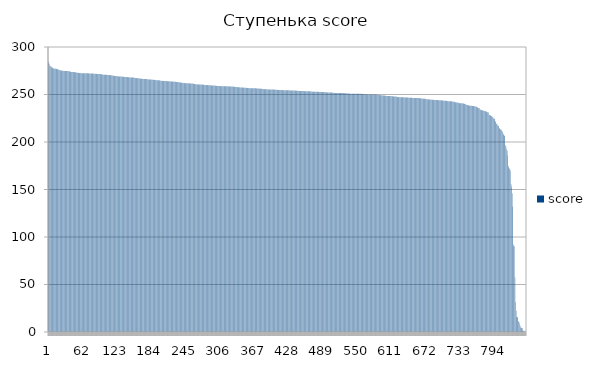
| Category | score |
|---|---|
| 0 | 284.9 |
| 1 | 283.2 |
| 2 | 282.4 |
| 3 | 279.9 |
| 4 | 279.7 |
| 5 | 279.5 |
| 6 | 278.6 |
| 7 | 278.5 |
| 8 | 277.8 |
| 9 | 277.4 |
| 10 | 277.4 |
| 11 | 277.4 |
| 12 | 277.3 |
| 13 | 277.1 |
| 14 | 277.1 |
| 15 | 276.9 |
| 16 | 276.9 |
| 17 | 276.4 |
| 18 | 276.2 |
| 19 | 276.1 |
| 20 | 275.9 |
| 21 | 275.4 |
| 22 | 275.2 |
| 23 | 275.2 |
| 24 | 275.1 |
| 25 | 275.1 |
| 26 | 275.1 |
| 27 | 275 |
| 28 | 275 |
| 29 | 274.8 |
| 30 | 274.8 |
| 31 | 274.7 |
| 32 | 274.7 |
| 33 | 274.7 |
| 34 | 274.7 |
| 35 | 274.7 |
| 36 | 274.6 |
| 37 | 274.6 |
| 38 | 274.2 |
| 39 | 274.2 |
| 40 | 273.7 |
| 41 | 273.7 |
| 42 | 273.7 |
| 43 | 273.6 |
| 44 | 273.6 |
| 45 | 273.6 |
| 46 | 273.5 |
| 47 | 273.5 |
| 48 | 273.5 |
| 49 | 273.5 |
| 50 | 273.1 |
| 51 | 273 |
| 52 | 272.9 |
| 53 | 272.9 |
| 54 | 272.7 |
| 55 | 272.7 |
| 56 | 272.7 |
| 57 | 272.6 |
| 58 | 272.6 |
| 59 | 272.5 |
| 60 | 272.5 |
| 61 | 272.4 |
| 62 | 272.4 |
| 63 | 272.4 |
| 64 | 272.4 |
| 65 | 272.4 |
| 66 | 272.4 |
| 67 | 272.4 |
| 68 | 272.4 |
| 69 | 272.4 |
| 70 | 272.3 |
| 71 | 272.3 |
| 72 | 272.2 |
| 73 | 272.2 |
| 74 | 272.2 |
| 75 | 272.2 |
| 76 | 272.2 |
| 77 | 272.1 |
| 78 | 272 |
| 79 | 272 |
| 80 | 272 |
| 81 | 271.9 |
| 82 | 271.9 |
| 83 | 271.9 |
| 84 | 271.8 |
| 85 | 271.8 |
| 86 | 271.7 |
| 87 | 271.6 |
| 88 | 271.6 |
| 89 | 271.6 |
| 90 | 271.6 |
| 91 | 271.6 |
| 92 | 271.6 |
| 93 | 271.5 |
| 94 | 271.3 |
| 95 | 271.1 |
| 96 | 271.1 |
| 97 | 271 |
| 98 | 270.9 |
| 99 | 270.8 |
| 100 | 270.8 |
| 101 | 270.8 |
| 102 | 270.7 |
| 103 | 270.7 |
| 104 | 270.7 |
| 105 | 270.6 |
| 106 | 270.4 |
| 107 | 270.4 |
| 108 | 270.4 |
| 109 | 270.4 |
| 110 | 270.3 |
| 111 | 270.2 |
| 112 | 270.2 |
| 113 | 270.1 |
| 114 | 270 |
| 115 | 270 |
| 116 | 269.8 |
| 117 | 269.6 |
| 118 | 269.6 |
| 119 | 269.6 |
| 120 | 269.6 |
| 121 | 269.4 |
| 122 | 269.3 |
| 123 | 269.2 |
| 124 | 269 |
| 125 | 269 |
| 126 | 269 |
| 127 | 269 |
| 128 | 269 |
| 129 | 268.9 |
| 130 | 268.9 |
| 131 | 268.8 |
| 132 | 268.8 |
| 133 | 268.8 |
| 134 | 268.7 |
| 135 | 268.5 |
| 136 | 268.4 |
| 137 | 268.4 |
| 138 | 268.4 |
| 139 | 268.3 |
| 140 | 268.3 |
| 141 | 268.2 |
| 142 | 268.2 |
| 143 | 268.1 |
| 144 | 268.1 |
| 145 | 268 |
| 146 | 268 |
| 147 | 267.9 |
| 148 | 267.9 |
| 149 | 267.9 |
| 150 | 267.9 |
| 151 | 267.8 |
| 152 | 267.8 |
| 153 | 267.7 |
| 154 | 267.5 |
| 155 | 267.4 |
| 156 | 267.3 |
| 157 | 267.2 |
| 158 | 267.2 |
| 159 | 267.2 |
| 160 | 267.2 |
| 161 | 267.1 |
| 162 | 266.8 |
| 163 | 266.7 |
| 164 | 266.7 |
| 165 | 266.6 |
| 166 | 266.6 |
| 167 | 266.6 |
| 168 | 266.4 |
| 169 | 266.4 |
| 170 | 266.4 |
| 171 | 266.4 |
| 172 | 266.4 |
| 173 | 266.4 |
| 174 | 266.3 |
| 175 | 266.1 |
| 176 | 266.1 |
| 177 | 266 |
| 178 | 265.9 |
| 179 | 265.9 |
| 180 | 265.9 |
| 181 | 265.8 |
| 182 | 265.8 |
| 183 | 265.7 |
| 184 | 265.6 |
| 185 | 265.6 |
| 186 | 265.6 |
| 187 | 265.4 |
| 188 | 265.4 |
| 189 | 265.3 |
| 190 | 265.3 |
| 191 | 265.2 |
| 192 | 265.1 |
| 193 | 265.1 |
| 194 | 265.1 |
| 195 | 265 |
| 196 | 265 |
| 197 | 264.9 |
| 198 | 264.8 |
| 199 | 264.6 |
| 200 | 264.5 |
| 201 | 264.5 |
| 202 | 264.5 |
| 203 | 264.3 |
| 204 | 264.3 |
| 205 | 264.2 |
| 206 | 264.2 |
| 207 | 264.2 |
| 208 | 264.2 |
| 209 | 264.2 |
| 210 | 264.2 |
| 211 | 264 |
| 212 | 264 |
| 213 | 264 |
| 214 | 263.9 |
| 215 | 263.9 |
| 216 | 263.8 |
| 217 | 263.7 |
| 218 | 263.7 |
| 219 | 263.7 |
| 220 | 263.6 |
| 221 | 263.6 |
| 222 | 263.6 |
| 223 | 263.4 |
| 224 | 263.4 |
| 225 | 263.3 |
| 226 | 263.3 |
| 227 | 263.2 |
| 228 | 263.2 |
| 229 | 263.1 |
| 230 | 262.9 |
| 231 | 262.9 |
| 232 | 262.9 |
| 233 | 262.8 |
| 234 | 262.7 |
| 235 | 262.6 |
| 236 | 262.5 |
| 237 | 262.3 |
| 238 | 262.3 |
| 239 | 262.3 |
| 240 | 262.2 |
| 241 | 262.1 |
| 242 | 262 |
| 243 | 261.9 |
| 244 | 261.9 |
| 245 | 261.9 |
| 246 | 261.9 |
| 247 | 261.8 |
| 248 | 261.8 |
| 249 | 261.8 |
| 250 | 261.8 |
| 251 | 261.6 |
| 252 | 261.5 |
| 253 | 261.5 |
| 254 | 261.5 |
| 255 | 261.5 |
| 256 | 261.5 |
| 257 | 261.4 |
| 258 | 261.3 |
| 259 | 261.1 |
| 260 | 261 |
| 261 | 260.8 |
| 262 | 260.8 |
| 263 | 260.8 |
| 264 | 260.7 |
| 265 | 260.6 |
| 266 | 260.6 |
| 267 | 260.5 |
| 268 | 260.5 |
| 269 | 260.5 |
| 270 | 260.5 |
| 271 | 260.5 |
| 272 | 260.5 |
| 273 | 260.4 |
| 274 | 260.3 |
| 275 | 260.3 |
| 276 | 260.3 |
| 277 | 260.1 |
| 278 | 260.1 |
| 279 | 260 |
| 280 | 260 |
| 281 | 260 |
| 282 | 259.9 |
| 283 | 259.8 |
| 284 | 259.8 |
| 285 | 259.7 |
| 286 | 259.7 |
| 287 | 259.7 |
| 288 | 259.7 |
| 289 | 259.6 |
| 290 | 259.6 |
| 291 | 259.6 |
| 292 | 259.6 |
| 293 | 259.5 |
| 294 | 259.5 |
| 295 | 259.4 |
| 296 | 259.2 |
| 297 | 259.2 |
| 298 | 259.1 |
| 299 | 259 |
| 300 | 259 |
| 301 | 259 |
| 302 | 258.9 |
| 303 | 258.9 |
| 304 | 258.9 |
| 305 | 258.9 |
| 306 | 258.8 |
| 307 | 258.8 |
| 308 | 258.8 |
| 309 | 258.8 |
| 310 | 258.8 |
| 311 | 258.7 |
| 312 | 258.7 |
| 313 | 258.7 |
| 314 | 258.7 |
| 315 | 258.7 |
| 316 | 258.7 |
| 317 | 258.6 |
| 318 | 258.6 |
| 319 | 258.6 |
| 320 | 258.5 |
| 321 | 258.4 |
| 322 | 258.4 |
| 323 | 258.4 |
| 324 | 258.4 |
| 325 | 258.3 |
| 326 | 258.3 |
| 327 | 258.3 |
| 328 | 258.2 |
| 329 | 258.2 |
| 330 | 258.1 |
| 331 | 258.1 |
| 332 | 258 |
| 333 | 257.9 |
| 334 | 257.8 |
| 335 | 257.8 |
| 336 | 257.7 |
| 337 | 257.7 |
| 338 | 257.6 |
| 339 | 257.6 |
| 340 | 257.5 |
| 341 | 257.5 |
| 342 | 257.4 |
| 343 | 257.3 |
| 344 | 257.3 |
| 345 | 257.3 |
| 346 | 257.3 |
| 347 | 257.2 |
| 348 | 257.1 |
| 349 | 257.1 |
| 350 | 257 |
| 351 | 257 |
| 352 | 256.9 |
| 353 | 256.8 |
| 354 | 256.8 |
| 355 | 256.8 |
| 356 | 256.8 |
| 357 | 256.7 |
| 358 | 256.7 |
| 359 | 256.7 |
| 360 | 256.7 |
| 361 | 256.7 |
| 362 | 256.7 |
| 363 | 256.6 |
| 364 | 256.6 |
| 365 | 256.5 |
| 366 | 256.5 |
| 367 | 256.5 |
| 368 | 256.5 |
| 369 | 256.4 |
| 370 | 256.4 |
| 371 | 256.3 |
| 372 | 256.3 |
| 373 | 256.3 |
| 374 | 256.3 |
| 375 | 256.1 |
| 376 | 256.1 |
| 377 | 256.1 |
| 378 | 256 |
| 379 | 256 |
| 380 | 255.8 |
| 381 | 255.7 |
| 382 | 255.7 |
| 383 | 255.7 |
| 384 | 255.5 |
| 385 | 255.5 |
| 386 | 255.5 |
| 387 | 255.4 |
| 388 | 255.4 |
| 389 | 255.3 |
| 390 | 255.3 |
| 391 | 255.3 |
| 392 | 255.3 |
| 393 | 255.3 |
| 394 | 255.3 |
| 395 | 255.3 |
| 396 | 255.2 |
| 397 | 255.2 |
| 398 | 255.2 |
| 399 | 255.2 |
| 400 | 255.2 |
| 401 | 255.2 |
| 402 | 255.1 |
| 403 | 255 |
| 404 | 255 |
| 405 | 255 |
| 406 | 255 |
| 407 | 254.8 |
| 408 | 254.8 |
| 409 | 254.8 |
| 410 | 254.8 |
| 411 | 254.7 |
| 412 | 254.7 |
| 413 | 254.7 |
| 414 | 254.7 |
| 415 | 254.7 |
| 416 | 254.6 |
| 417 | 254.6 |
| 418 | 254.6 |
| 419 | 254.6 |
| 420 | 254.6 |
| 421 | 254.6 |
| 422 | 254.6 |
| 423 | 254.5 |
| 424 | 254.5 |
| 425 | 254.4 |
| 426 | 254.4 |
| 427 | 254.4 |
| 428 | 254.4 |
| 429 | 254.3 |
| 430 | 254.3 |
| 431 | 254.2 |
| 432 | 254.2 |
| 433 | 254.2 |
| 434 | 254.2 |
| 435 | 254.2 |
| 436 | 254.1 |
| 437 | 254.1 |
| 438 | 254.1 |
| 439 | 254 |
| 440 | 254 |
| 441 | 254 |
| 442 | 254 |
| 443 | 253.9 |
| 444 | 253.9 |
| 445 | 253.8 |
| 446 | 253.8 |
| 447 | 253.8 |
| 448 | 253.8 |
| 449 | 253.7 |
| 450 | 253.6 |
| 451 | 253.6 |
| 452 | 253.6 |
| 453 | 253.5 |
| 454 | 253.5 |
| 455 | 253.5 |
| 456 | 253.5 |
| 457 | 253.5 |
| 458 | 253.4 |
| 459 | 253.4 |
| 460 | 253.4 |
| 461 | 253.4 |
| 462 | 253.3 |
| 463 | 253.3 |
| 464 | 253.3 |
| 465 | 253.2 |
| 466 | 253.2 |
| 467 | 253.1 |
| 468 | 253.1 |
| 469 | 253 |
| 470 | 253 |
| 471 | 253 |
| 472 | 252.9 |
| 473 | 252.9 |
| 474 | 252.9 |
| 475 | 252.8 |
| 476 | 252.8 |
| 477 | 252.8 |
| 478 | 252.8 |
| 479 | 252.8 |
| 480 | 252.8 |
| 481 | 252.7 |
| 482 | 252.7 |
| 483 | 252.7 |
| 484 | 252.7 |
| 485 | 252.6 |
| 486 | 252.6 |
| 487 | 252.6 |
| 488 | 252.6 |
| 489 | 252.6 |
| 490 | 252.6 |
| 491 | 252.5 |
| 492 | 252.4 |
| 493 | 252.4 |
| 494 | 252.3 |
| 495 | 252.2 |
| 496 | 252.2 |
| 497 | 252.2 |
| 498 | 252.1 |
| 499 | 252.1 |
| 500 | 252.1 |
| 501 | 252 |
| 502 | 252 |
| 503 | 252 |
| 504 | 251.9 |
| 505 | 251.8 |
| 506 | 251.8 |
| 507 | 251.8 |
| 508 | 251.7 |
| 509 | 251.7 |
| 510 | 251.7 |
| 511 | 251.7 |
| 512 | 251.7 |
| 513 | 251.7 |
| 514 | 251.6 |
| 515 | 251.5 |
| 516 | 251.5 |
| 517 | 251.5 |
| 518 | 251.5 |
| 519 | 251.5 |
| 520 | 251.5 |
| 521 | 251.5 |
| 522 | 251.5 |
| 523 | 251.5 |
| 524 | 251.5 |
| 525 | 251.4 |
| 526 | 251.3 |
| 527 | 251.3 |
| 528 | 251.2 |
| 529 | 251.2 |
| 530 | 251.2 |
| 531 | 251.1 |
| 532 | 251 |
| 533 | 251 |
| 534 | 251 |
| 535 | 250.9 |
| 536 | 250.9 |
| 537 | 250.9 |
| 538 | 250.9 |
| 539 | 250.8 |
| 540 | 250.8 |
| 541 | 250.8 |
| 542 | 250.8 |
| 543 | 250.8 |
| 544 | 250.8 |
| 545 | 250.8 |
| 546 | 250.8 |
| 547 | 250.8 |
| 548 | 250.8 |
| 549 | 250.8 |
| 550 | 250.8 |
| 551 | 250.8 |
| 552 | 250.8 |
| 553 | 250.7 |
| 554 | 250.7 |
| 555 | 250.7 |
| 556 | 250.6 |
| 557 | 250.6 |
| 558 | 250.5 |
| 559 | 250.5 |
| 560 | 250.4 |
| 561 | 250.3 |
| 562 | 250.3 |
| 563 | 250.2 |
| 564 | 250.2 |
| 565 | 250.1 |
| 566 | 250.1 |
| 567 | 250.1 |
| 568 | 250.1 |
| 569 | 250.1 |
| 570 | 250.1 |
| 571 | 250 |
| 572 | 250 |
| 573 | 250 |
| 574 | 250 |
| 575 | 250 |
| 576 | 250 |
| 577 | 249.9 |
| 578 | 249.9 |
| 579 | 249.9 |
| 580 | 249.9 |
| 581 | 249.8 |
| 582 | 249.8 |
| 583 | 249.8 |
| 584 | 249.7 |
| 585 | 249.7 |
| 586 | 249.6 |
| 587 | 249.4 |
| 588 | 249.4 |
| 589 | 249.3 |
| 590 | 249.3 |
| 591 | 249.3 |
| 592 | 249.1 |
| 593 | 249 |
| 594 | 248.9 |
| 595 | 248.9 |
| 596 | 248.9 |
| 597 | 248.8 |
| 598 | 248.8 |
| 599 | 248.7 |
| 600 | 248.5 |
| 601 | 248.4 |
| 602 | 248.4 |
| 603 | 248.4 |
| 604 | 248.3 |
| 605 | 248.3 |
| 606 | 248.3 |
| 607 | 248.3 |
| 608 | 248.3 |
| 609 | 248.1 |
| 610 | 248.1 |
| 611 | 248.1 |
| 612 | 248 |
| 613 | 248 |
| 614 | 248 |
| 615 | 248 |
| 616 | 247.9 |
| 617 | 247.8 |
| 618 | 247.7 |
| 619 | 247.5 |
| 620 | 247.5 |
| 621 | 247.5 |
| 622 | 247.4 |
| 623 | 247.2 |
| 624 | 247.2 |
| 625 | 247.2 |
| 626 | 247.1 |
| 627 | 247.1 |
| 628 | 247.1 |
| 629 | 247.1 |
| 630 | 247.1 |
| 631 | 247 |
| 632 | 246.9 |
| 633 | 246.9 |
| 634 | 246.9 |
| 635 | 246.9 |
| 636 | 246.8 |
| 637 | 246.8 |
| 638 | 246.8 |
| 639 | 246.6 |
| 640 | 246.6 |
| 641 | 246.6 |
| 642 | 246.6 |
| 643 | 246.5 |
| 644 | 246.5 |
| 645 | 246.5 |
| 646 | 246.5 |
| 647 | 246.4 |
| 648 | 246.4 |
| 649 | 246.4 |
| 650 | 246.3 |
| 651 | 246.3 |
| 652 | 246.3 |
| 653 | 246.2 |
| 654 | 246.2 |
| 655 | 246.2 |
| 656 | 246.2 |
| 657 | 246.2 |
| 658 | 246.2 |
| 659 | 246 |
| 660 | 246 |
| 661 | 245.9 |
| 662 | 245.8 |
| 663 | 245.8 |
| 664 | 245.7 |
| 665 | 245.5 |
| 666 | 245.5 |
| 667 | 245.5 |
| 668 | 245.4 |
| 669 | 245.4 |
| 670 | 245.2 |
| 671 | 245.1 |
| 672 | 245 |
| 673 | 245 |
| 674 | 244.9 |
| 675 | 244.8 |
| 676 | 244.8 |
| 677 | 244.7 |
| 678 | 244.7 |
| 679 | 244.7 |
| 680 | 244.6 |
| 681 | 244.5 |
| 682 | 244.5 |
| 683 | 244.4 |
| 684 | 244.3 |
| 685 | 244.3 |
| 686 | 244.3 |
| 687 | 244.2 |
| 688 | 244.2 |
| 689 | 244.2 |
| 690 | 244.1 |
| 691 | 244.1 |
| 692 | 244 |
| 693 | 243.9 |
| 694 | 243.9 |
| 695 | 243.9 |
| 696 | 243.9 |
| 697 | 243.9 |
| 698 | 243.8 |
| 699 | 243.7 |
| 700 | 243.7 |
| 701 | 243.7 |
| 702 | 243.5 |
| 703 | 243.5 |
| 704 | 243.5 |
| 705 | 243.4 |
| 706 | 243.3 |
| 707 | 243.2 |
| 708 | 243.2 |
| 709 | 243 |
| 710 | 242.9 |
| 711 | 242.9 |
| 712 | 242.9 |
| 713 | 242.9 |
| 714 | 242.9 |
| 715 | 242.9 |
| 716 | 242.7 |
| 717 | 242.6 |
| 718 | 242.4 |
| 719 | 242.3 |
| 720 | 242.3 |
| 721 | 242.3 |
| 722 | 241.8 |
| 723 | 241.7 |
| 724 | 241.6 |
| 725 | 241.5 |
| 726 | 241.4 |
| 727 | 241.2 |
| 728 | 241.2 |
| 729 | 240.9 |
| 730 | 240.9 |
| 731 | 240.8 |
| 732 | 240.8 |
| 733 | 240.8 |
| 734 | 240.7 |
| 735 | 240.6 |
| 736 | 240.4 |
| 737 | 240.4 |
| 738 | 240.2 |
| 739 | 240 |
| 740 | 239.7 |
| 741 | 239.5 |
| 742 | 239.1 |
| 743 | 238.9 |
| 744 | 238.9 |
| 745 | 238.6 |
| 746 | 238.5 |
| 747 | 238.5 |
| 748 | 238.2 |
| 749 | 238.2 |
| 750 | 238.2 |
| 751 | 238.1 |
| 752 | 238 |
| 753 | 238 |
| 754 | 238 |
| 755 | 237.8 |
| 756 | 237.8 |
| 757 | 237.4 |
| 758 | 237.3 |
| 759 | 237.3 |
| 760 | 236.9 |
| 761 | 236.9 |
| 762 | 235.8 |
| 763 | 235.8 |
| 764 | 235.6 |
| 765 | 235.5 |
| 766 | 234.5 |
| 767 | 233.7 |
| 768 | 233.6 |
| 769 | 233.4 |
| 770 | 233.4 |
| 771 | 233.1 |
| 772 | 232.9 |
| 773 | 232.8 |
| 774 | 232.7 |
| 775 | 232.6 |
| 776 | 232.2 |
| 777 | 232 |
| 778 | 231.7 |
| 779 | 231.4 |
| 780 | 231.3 |
| 781 | 231.1 |
| 782 | 228.8 |
| 783 | 228.4 |
| 784 | 228.3 |
| 785 | 227.5 |
| 786 | 227.5 |
| 787 | 227.2 |
| 788 | 226.7 |
| 789 | 225.9 |
| 790 | 224.8 |
| 791 | 224.5 |
| 792 | 224.4 |
| 793 | 222 |
| 794 | 220.8 |
| 795 | 219.3 |
| 796 | 219.3 |
| 797 | 217.6 |
| 798 | 217 |
| 799 | 216.8 |
| 800 | 214.8 |
| 801 | 213.9 |
| 802 | 213.7 |
| 803 | 212.8 |
| 804 | 212.7 |
| 805 | 211.6 |
| 806 | 210.4 |
| 807 | 208.6 |
| 808 | 207.3 |
| 809 | 206.8 |
| 810 | 206.4 |
| 811 | 196.7 |
| 812 | 195.2 |
| 813 | 192.4 |
| 814 | 190.8 |
| 815 | 185.7 |
| 816 | 175.1 |
| 817 | 173.4 |
| 818 | 172.1 |
| 819 | 171.6 |
| 820 | 169.8 |
| 821 | 155.5 |
| 822 | 152.9 |
| 823 | 146 |
| 824 | 132.1 |
| 825 | 92.5 |
| 826 | 90.3 |
| 827 | 90.3 |
| 828 | 57.3 |
| 829 | 31.2 |
| 830 | 22.3 |
| 831 | 15.9 |
| 832 | 15.8 |
| 833 | 15.2 |
| 834 | 11.4 |
| 835 | 11 |
| 836 | 9.3 |
| 837 | 6.8 |
| 838 | 4.8 |
| 839 | 4.6 |
| 840 | 4.3 |
| 841 | 4.2 |
| 842 | 1.8 |
| 843 | 1.7 |
| 844 | 0.9 |
| 845 | 0.6 |
| 846 | 0.4 |
| 847 | 0.2 |